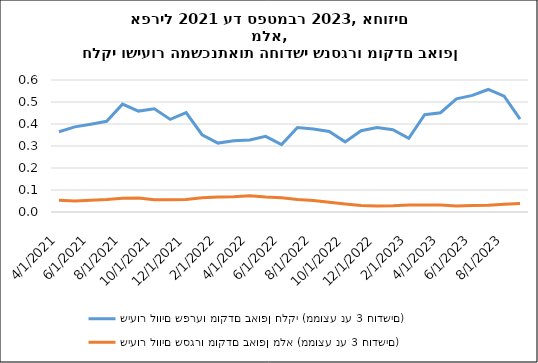
| Category | שיעור לווים שפרעו מוקדם באופן חלקי (ממוצע נע 3 חודשים) | שיעור לווים שסגרו מוקדם באופן מלא (ממוצע נע 3 חודשים) |
|---|---|---|
| 4/30/21 | 0.365 | 0.053 |
| 5/31/21 | 0.387 | 0.05 |
| 6/30/21 | 0.399 | 0.053 |
| 7/31/21 | 0.412 | 0.057 |
| 8/31/21 | 0.49 | 0.063 |
| 9/30/21 | 0.459 | 0.064 |
| 10/31/21 | 0.469 | 0.056 |
| 11/30/21 | 0.421 | 0.055 |
| 12/31/21 | 0.452 | 0.057 |
| 1/31/22 | 0.351 | 0.065 |
| 2/28/22 | 0.313 | 0.069 |
| 3/31/22 | 0.324 | 0.069 |
| 4/30/22 | 0.327 | 0.074 |
| 5/31/22 | 0.344 | 0.068 |
| 6/30/22 | 0.307 | 0.065 |
| 7/31/22 | 0.384 | 0.056 |
| 8/31/22 | 0.377 | 0.052 |
| 9/30/22 | 0.366 | 0.044 |
| 10/31/22 | 0.319 | 0.036 |
| 11/30/22 | 0.369 | 0.03 |
| 12/31/22 | 0.384 | 0.028 |
| 1/31/23 | 0.374 | 0.028 |
| 2/28/23 | 0.335 | 0.032 |
| 3/31/23 | 0.442 | 0.031 |
| 4/30/23 | 0.451 | 0.032 |
| 5/31/23 | 0.514 | 0.028 |
| 6/30/23 | 0.53 | 0.029 |
| 7/31/23 | 0.557 | 0.03 |
| 8/31/23 | 0.526 | 0.035 |
| 9/30/23 | 0.423 | 0.038 |